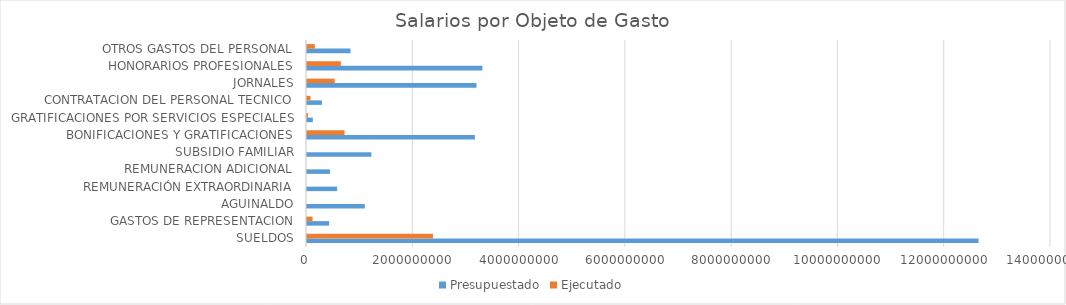
| Category | Presupuestado | Ejecutado |
|---|---|---|
| SUELDOS | 12637200000 | 2370300000 |
| GASTOS DE REPRESENTACION | 416148000 | 104037000 |
| AGUINALDO | 1087779000 | 0 |
| REMUNERACIÓN EXTRAORDINARIA | 567333416 | 0 |
| REMUNERACION ADICIONAL | 432263864 | 0 |
| SUBSIDIO FAMILIAR | 1211500536 | 0 |
| BONIFICACIONES Y GRATIFICACIONES | 3159500715 | 706544502 |
| GRATIFICACIONES POR SERVICIOS ESPECIALES | 110000000 | 18360000 |
| CONTRATACION DEL PERSONAL TECNICO | 281003000 | 66105000 |
| JORNALES | 3188925357 | 520827580 |
| HONORARIOS PROFESIONALES | 3300542072 | 636637468 |
| OTROS GASTOS DEL PERSONAL | 817938601 | 147854449 |